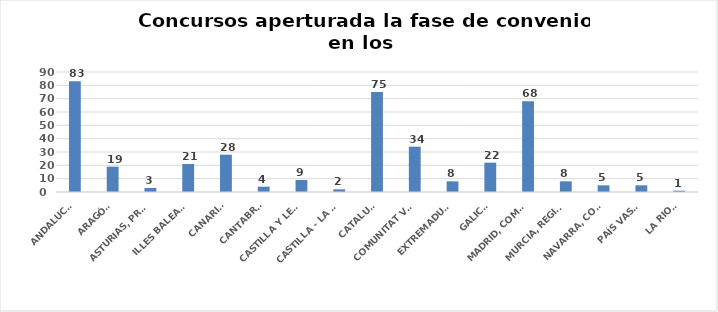
| Category | Series 0 |
|---|---|
| ANDALUCÍA | 83 |
| ARAGÓN | 19 |
| ASTURIAS, PRINCIPADO | 3 |
| ILLES BALEARS | 21 |
| CANARIAS | 28 |
| CANTABRIA | 4 |
| CASTILLA Y LEÓN | 9 |
| CASTILLA - LA MANCHA | 2 |
| CATALUÑA | 75 |
| COMUNITAT VALENCIANA | 34 |
| EXTREMADURA | 8 |
| GALICIA | 22 |
| MADRID, COMUNIDAD | 68 |
| MURCIA, REGIÓN | 8 |
| NAVARRA, COM. FORAL | 5 |
| PAÍS VASCO | 5 |
| LA RIOJA | 1 |